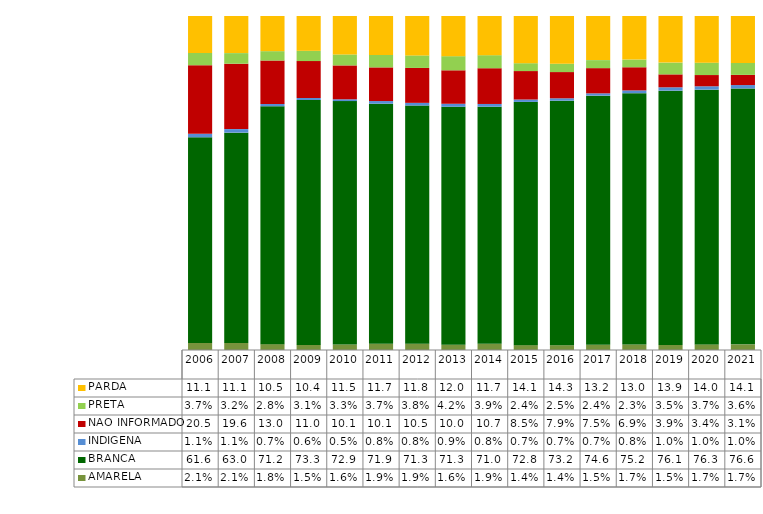
| Category | AMARELA | BRANCA | INDIGENA | NAO INFORMADO | PRETA | PARDA |
|---|---|---|---|---|---|---|
| 2006.0 | 0.021 | 0.616 | 0.011 | 0.205 | 0.037 | 0.111 |
| 2007.0 | 0.021 | 0.63 | 0.011 | 0.196 | 0.032 | 0.111 |
| 2008.0 | 0.018 | 0.712 | 0.007 | 0.13 | 0.028 | 0.105 |
| 2009.0 | 0.015 | 0.733 | 0.006 | 0.11 | 0.031 | 0.104 |
| 2010.0 | 0.016 | 0.729 | 0.005 | 0.101 | 0.033 | 0.115 |
| 2011.0 | 0.019 | 0.719 | 0.008 | 0.101 | 0.037 | 0.117 |
| 2012.0 | 0.019 | 0.713 | 0.008 | 0.105 | 0.038 | 0.118 |
| 2013.0 | 0.016 | 0.713 | 0.009 | 0.1 | 0.042 | 0.12 |
| 2014.0 | 0.019 | 0.71 | 0.008 | 0.107 | 0.039 | 0.117 |
| 2015.0 | 0.014 | 0.728 | 0.007 | 0.085 | 0.024 | 0.141 |
| 2016.0 | 0.014 | 0.732 | 0.007 | 0.079 | 0.025 | 0.143 |
| 2017.0 | 0.015 | 0.746 | 0.007 | 0.075 | 0.024 | 0.132 |
| 2018.0 | 0.017 | 0.752 | 0.008 | 0.069 | 0.023 | 0.13 |
| 2019.0 | 0.015 | 0.761 | 0.01 | 0.039 | 0.035 | 0.139 |
| 2020.0 | 0.017 | 0.763 | 0.01 | 0.034 | 0.037 | 0.14 |
| 2021.0 | 0.017 | 0.766 | 0.01 | 0.031 | 0.036 | 0.141 |